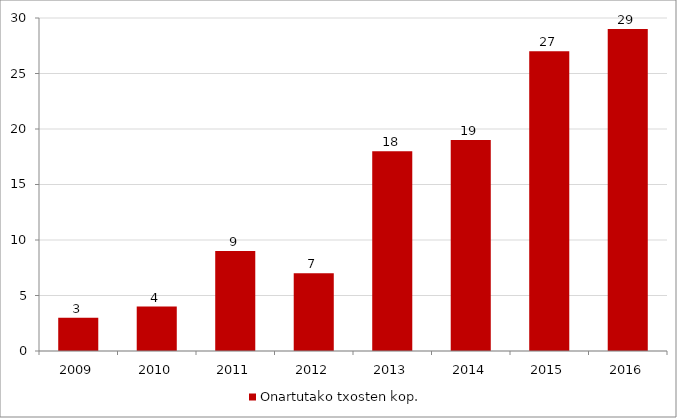
| Category | Onartutako txosten kop. |
|---|---|
| 2009.0 | 3 |
| 2010.0 | 4 |
| 2011.0 | 9 |
| 2012.0 | 7 |
| 2013.0 | 18 |
| 2014.0 | 19 |
| 2015.0 | 27 |
| 2016.0 | 29 |